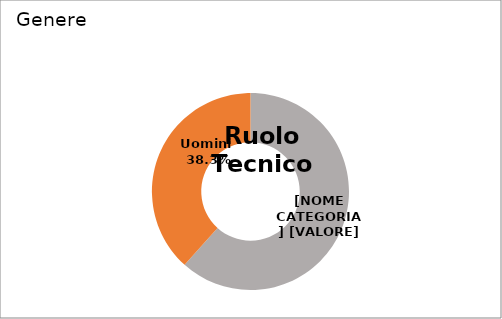
| Category | Series 0 |
|---|---|
| Donne  | 0.617 |
| Uomini  | 0.383 |